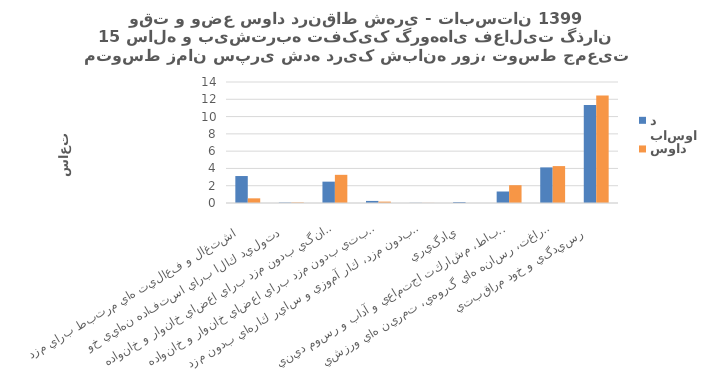
| Category | باسواد | بي سواد |
|---|---|---|
| اشتغال و فعاليت هاي مرتبط براي مزد  | 3.12 | 0.54 |
| توليد كالا براي استفاده نهايي خود   | 0.05 | 0.06 |
| خدمات خانگي بدون مزد براي اعضاي خانوار و خانواده   | 2.47 | 3.26 |
| خدمات مراقبتي بدون مزد براي اعضاي خانوار و خانواده   | 0.24 | 0.16 |
| كارداوطلبانه بدون مزد، كار آموزي و ساير كارهاي بدون مزد  | 0.02 | 0.01 |
| يادگيري  | 0.11 | 0 |
| معاشرت، ارتباط، مشاركت اجتماعي و آداب و رسوم ديني  | 1.33 | 2.06 |
| فرهنگ، فراغت، رسانه هاي گروهي، تمرين هاي ورزشي  | 4.12 | 4.27 |
| رسيدگي و خود مراقبتي   | 11.34 | 12.44 |